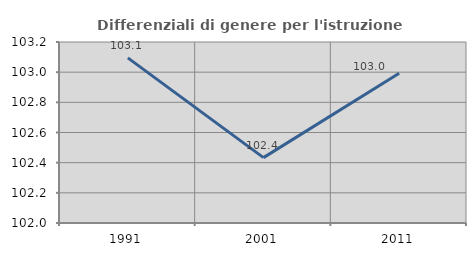
| Category | Differenziali di genere per l'istruzione superiore |
|---|---|
| 1991.0 | 103.095 |
| 2001.0 | 102.433 |
| 2011.0 | 102.992 |